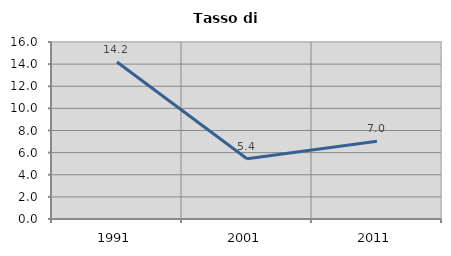
| Category | Tasso di disoccupazione   |
|---|---|
| 1991.0 | 14.187 |
| 2001.0 | 5.441 |
| 2011.0 | 7.025 |